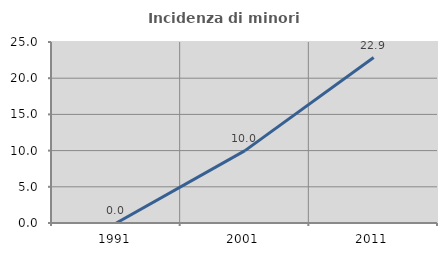
| Category | Incidenza di minori stranieri |
|---|---|
| 1991.0 | 0 |
| 2001.0 | 10 |
| 2011.0 | 22.857 |